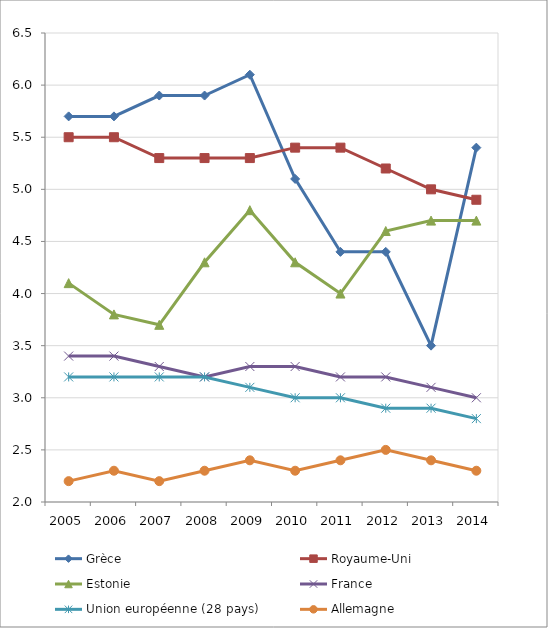
| Category | Grèce | Royaume-Uni | Estonie | France | Union européenne (28 pays) | Allemagne |
|---|---|---|---|---|---|---|
| 2005 | 5.7 | 5.5 | 4.1 | 3.4 | 3.2 | 2.2 |
| 2006 | 5.7 | 5.5 | 3.8 | 3.4 | 3.2 | 2.3 |
| 2007 | 5.9 | 5.3 | 3.7 | 3.3 | 3.2 | 2.2 |
| 2008 | 5.9 | 5.3 | 4.3 | 3.2 | 3.2 | 2.3 |
| 2009 | 6.1 | 5.3 | 4.8 | 3.3 | 3.1 | 2.4 |
| 2010 | 5.1 | 5.4 | 4.3 | 3.3 | 3 | 2.3 |
| 2011 | 4.4 | 5.4 | 4 | 3.2 | 3 | 2.4 |
| 2012 | 4.4 | 5.2 | 4.6 | 3.2 | 2.9 | 2.5 |
| 2013 | 3.5 | 5 | 4.7 | 3.1 | 2.9 | 2.4 |
| 2014 | 5.4 | 4.9 | 4.7 | 3 | 2.8 | 2.3 |